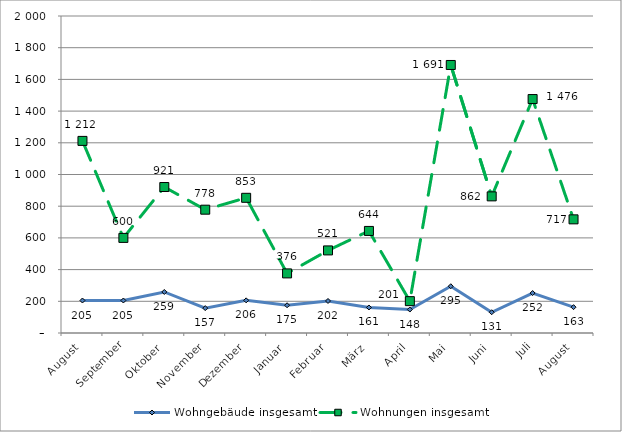
| Category | Wohngebäude insgesamt | Wohnungen insgesamt |
|---|---|---|
| August | 205 | 1212 |
| September | 205 | 600 |
| Oktober | 259 | 921 |
| November | 157 | 778 |
| Dezember | 206 | 853 |
| Januar | 175 | 376 |
| Februar | 202 | 521 |
| März | 161 | 644 |
| April | 148 | 201 |
| Mai | 295 | 1691 |
| Juni | 131 | 862 |
| Juli | 252 | 1476 |
| August | 163 | 717 |